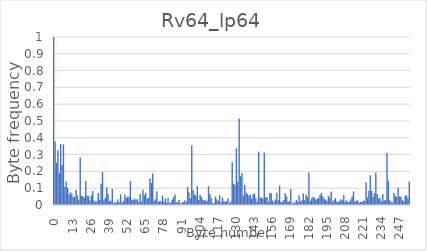
| Category | Series 0 |
|---|---|
| 0.0 | 1 |
| 1.0 | 0.378 |
| 2.0 | 0.252 |
| 3.0 | 0.327 |
| 4.0 | 0.19 |
| 5.0 | 0.363 |
| 6.0 | 0.238 |
| 7.0 | 0.361 |
| 8.0 | 0.107 |
| 9.0 | 0.14 |
| 10.0 | 0.102 |
| 11.0 | 0.061 |
| 12.0 | 0.076 |
| 13.0 | 0.068 |
| 14.0 | 0.045 |
| 15.0 | 0.048 |
| 16.0 | 0.091 |
| 17.0 | 0.057 |
| 18.0 | 0.029 |
| 19.0 | 0.282 |
| 20.0 | 0.054 |
| 21.0 | 0.052 |
| 22.0 | 0.045 |
| 23.0 | 0.143 |
| 24.0 | 0.057 |
| 25.0 | 0.053 |
| 26.0 | 0.027 |
| 27.0 | 0.057 |
| 28.0 | 0.084 |
| 29.0 | 0.026 |
| 30.0 | 0.019 |
| 31.0 | 0.023 |
| 32.0 | 0.071 |
| 33.0 | 0.031 |
| 34.0 | 0.129 |
| 35.0 | 0.196 |
| 36.0 | 0.029 |
| 37.0 | 0.043 |
| 38.0 | 0.105 |
| 39.0 | 0.066 |
| 40.0 | 0.024 |
| 41.0 | 0.025 |
| 42.0 | 0.095 |
| 43.0 | 0.009 |
| 44.0 | 0.019 |
| 45.0 | 0.015 |
| 46.0 | 0.034 |
| 47.0 | 0.017 |
| 48.0 | 0.064 |
| 49.0 | 0.014 |
| 50.0 | 0.024 |
| 51.0 | 0.061 |
| 52.0 | 0.041 |
| 53.0 | 0.049 |
| 54.0 | 0.048 |
| 55.0 | 0.143 |
| 56.0 | 0.032 |
| 57.0 | 0.03 |
| 58.0 | 0.038 |
| 59.0 | 0.029 |
| 60.0 | 0.035 |
| 61.0 | 0.018 |
| 62.0 | 0.066 |
| 63.0 | 0.021 |
| 64.0 | 0.091 |
| 65.0 | 0.059 |
| 66.0 | 0.073 |
| 67.0 | 0.035 |
| 68.0 | 0.042 |
| 69.0 | 0.157 |
| 70.0 | 0.131 |
| 71.0 | 0.188 |
| 72.0 | 0.025 |
| 73.0 | 0.034 |
| 74.0 | 0.081 |
| 75.0 | 0.02 |
| 76.0 | 0.021 |
| 77.0 | 0.023 |
| 78.0 | 0.056 |
| 79.0 | 0.02 |
| 80.0 | 0.039 |
| 81.0 | 0.014 |
| 82.0 | 0.041 |
| 83.0 | 0.011 |
| 84.0 | 0.018 |
| 85.0 | 0.033 |
| 86.0 | 0.051 |
| 87.0 | 0.063 |
| 88.0 | 0.015 |
| 89.0 | 0.018 |
| 90.0 | 0.03 |
| 91.0 | 0.008 |
| 92.0 | 0.016 |
| 93.0 | 0.017 |
| 94.0 | 0.028 |
| 95.0 | 0.019 |
| 96.0 | 0.107 |
| 97.0 | 0.076 |
| 98.0 | 0.041 |
| 99.0 | 0.356 |
| 100.0 | 0.088 |
| 101.0 | 0.063 |
| 102.0 | 0.056 |
| 103.0 | 0.112 |
| 104.0 | 0.031 |
| 105.0 | 0.061 |
| 106.0 | 0.048 |
| 107.0 | 0.03 |
| 108.0 | 0.029 |
| 109.0 | 0.026 |
| 110.0 | 0.025 |
| 111.0 | 0.112 |
| 112.0 | 0.065 |
| 113.0 | 0.04 |
| 114.0 | 0.01 |
| 115.0 | 0.013 |
| 116.0 | 0.051 |
| 117.0 | 0.034 |
| 118.0 | 0.024 |
| 119.0 | 0.057 |
| 120.0 | 0.015 |
| 121.0 | 0.045 |
| 122.0 | 0.024 |
| 123.0 | 0.02 |
| 124.0 | 0.023 |
| 125.0 | 0.04 |
| 126.0 | 0.011 |
| 127.0 | 0.022 |
| 128.0 | 0.255 |
| 129.0 | 0.127 |
| 130.0 | 0.119 |
| 131.0 | 0.337 |
| 132.0 | 0.138 |
| 133.0 | 0.515 |
| 134.0 | 0.171 |
| 135.0 | 0.19 |
| 136.0 | 0.055 |
| 137.0 | 0.119 |
| 138.0 | 0.073 |
| 139.0 | 0.066 |
| 140.0 | 0.055 |
| 141.0 | 0.06 |
| 142.0 | 0.039 |
| 143.0 | 0.063 |
| 144.0 | 0.068 |
| 145.0 | 0.041 |
| 146.0 | 0.018 |
| 147.0 | 0.317 |
| 148.0 | 0.044 |
| 149.0 | 0.044 |
| 150.0 | 0.039 |
| 151.0 | 0.311 |
| 152.0 | 0.044 |
| 153.0 | 0.048 |
| 154.0 | 0.02 |
| 155.0 | 0.073 |
| 156.0 | 0.069 |
| 157.0 | 0.027 |
| 158.0 | 0.018 |
| 159.0 | 0.032 |
| 160.0 | 0.074 |
| 161.0 | 0.028 |
| 162.0 | 0.116 |
| 163.0 | 0.02 |
| 164.0 | 0.017 |
| 165.0 | 0.03 |
| 166.0 | 0.071 |
| 167.0 | 0.052 |
| 168.0 | 0.021 |
| 169.0 | 0.022 |
| 170.0 | 0.097 |
| 171.0 | 0.009 |
| 172.0 | 0.014 |
| 173.0 | 0.015 |
| 174.0 | 0.029 |
| 175.0 | 0.018 |
| 176.0 | 0.056 |
| 177.0 | 0.02 |
| 178.0 | 0.028 |
| 179.0 | 0.07 |
| 180.0 | 0.028 |
| 181.0 | 0.062 |
| 182.0 | 0.049 |
| 183.0 | 0.192 |
| 184.0 | 0.024 |
| 185.0 | 0.039 |
| 186.0 | 0.048 |
| 187.0 | 0.044 |
| 188.0 | 0.032 |
| 189.0 | 0.038 |
| 190.0 | 0.041 |
| 191.0 | 0.059 |
| 192.0 | 0.072 |
| 193.0 | 0.051 |
| 194.0 | 0.036 |
| 195.0 | 0.031 |
| 196.0 | 0.024 |
| 197.0 | 0.054 |
| 198.0 | 0.043 |
| 199.0 | 0.081 |
| 200.0 | 0.02 |
| 201.0 | 0.03 |
| 202.0 | 0.042 |
| 203.0 | 0.021 |
| 204.0 | 0.017 |
| 205.0 | 0.024 |
| 206.0 | 0.035 |
| 207.0 | 0.029 |
| 208.0 | 0.059 |
| 209.0 | 0.019 |
| 210.0 | 0.029 |
| 211.0 | 0.017 |
| 212.0 | 0.02 |
| 213.0 | 0.033 |
| 214.0 | 0.051 |
| 215.0 | 0.081 |
| 216.0 | 0.02 |
| 217.0 | 0.026 |
| 218.0 | 0.026 |
| 219.0 | 0.012 |
| 220.0 | 0.019 |
| 221.0 | 0.018 |
| 222.0 | 0.026 |
| 223.0 | 0.023 |
| 224.0 | 0.134 |
| 225.0 | 0.045 |
| 226.0 | 0.084 |
| 227.0 | 0.177 |
| 228.0 | 0.085 |
| 229.0 | 0.048 |
| 230.0 | 0.07 |
| 231.0 | 0.194 |
| 232.0 | 0.066 |
| 233.0 | 0.04 |
| 234.0 | 0.04 |
| 235.0 | 0.021 |
| 236.0 | 0.066 |
| 237.0 | 0.028 |
| 238.0 | 0.031 |
| 239.0 | 0.31 |
| 240.0 | 0.144 |
| 241.0 | 0.029 |
| 242.0 | 0.019 |
| 243.0 | 0.015 |
| 244.0 | 0.072 |
| 245.0 | 0.054 |
| 246.0 | 0.047 |
| 247.0 | 0.102 |
| 248.0 | 0.05 |
| 249.0 | 0.051 |
| 250.0 | 0.03 |
| 251.0 | 0.022 |
| 252.0 | 0.056 |
| 253.0 | 0.058 |
| 254.0 | 0.042 |
| 255.0 | 0.141 |